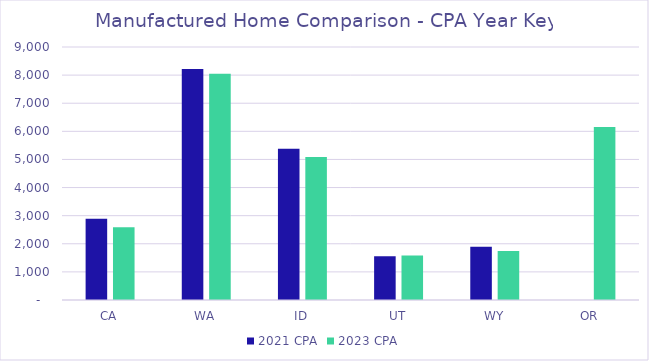
| Category | 2021 CPA | 2023 CPA |
|---|---|---|
|  CA  | 2891.074 | 2583.554 |
|  WA  | 8217.923 | 8048.355 |
|  ID  | 5380.233 | 5087.195 |
|  UT  | 1557.572 | 1579.844 |
|  WY  | 1897.171 | 1742.26 |
|  OR  | 0 | 6157.866 |